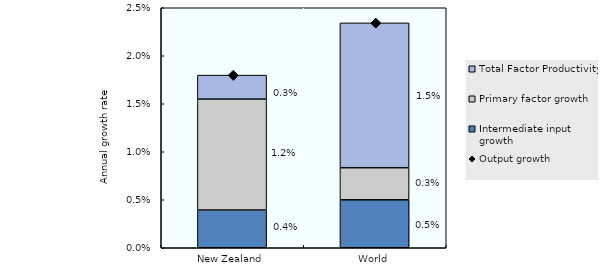
| Category | Intermediate input growth | Primary factor growth | Total Factor Productivity |
|---|---|---|---|
| New Zealand | 0.004 | 0.012 | 0.003 |
| World | 0.005 | 0.003 | 0.015 |